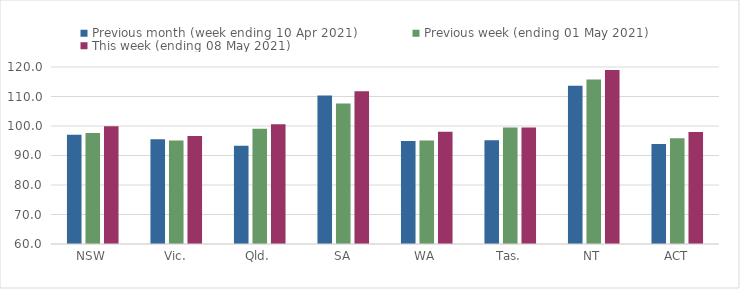
| Category | Previous month (week ending 10 Apr 2021) | Previous week (ending 01 May 2021) | This week (ending 08 May 2021) |
|---|---|---|---|
| NSW | 97.03 | 97.61 | 99.95 |
| Vic. | 95.47 | 95.09 | 96.62 |
| Qld. | 93.27 | 99.09 | 100.59 |
| SA | 110.36 | 107.66 | 111.8 |
| WA | 94.91 | 95.05 | 98.08 |
| Tas. | 95.15 | 99.52 | 99.52 |
| NT | 113.65 | 115.8 | 118.98 |
| ACT | 93.87 | 95.87 | 98 |